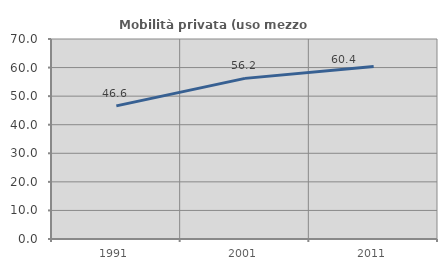
| Category | Mobilità privata (uso mezzo privato) |
|---|---|
| 1991.0 | 46.584 |
| 2001.0 | 56.219 |
| 2011.0 | 60.405 |